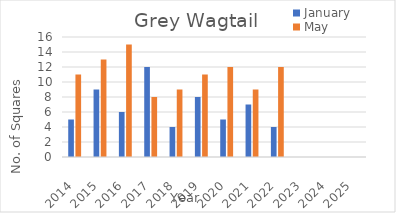
| Category | January | May |
|---|---|---|
| 2014.0 | 5 | 11 |
| 2015.0 | 9 | 13 |
| 2016.0 | 6 | 15 |
| 2017.0 | 12 | 8 |
| 2018.0 | 4 | 9 |
| 2019.0 | 8 | 11 |
| 2020.0 | 5 | 12 |
| 2021.0 | 7 | 9 |
| 2022.0 | 4 | 12 |
| 2023.0 | 0 | 0 |
| 2024.0 | 0 | 0 |
| 2025.0 | 0 | 0 |